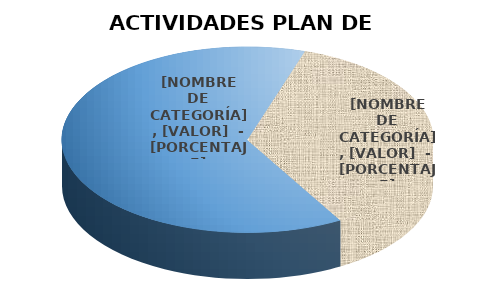
| Category | Series 0 |
|---|---|
| Otras actividades | 19 |
| Planes Dec 612/2018 | 11 |